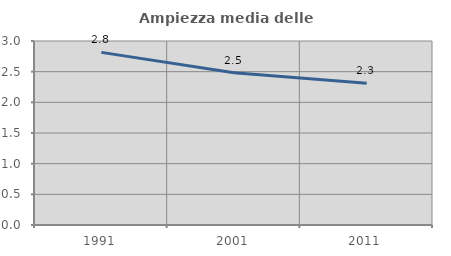
| Category | Ampiezza media delle famiglie |
|---|---|
| 1991.0 | 2.814 |
| 2001.0 | 2.483 |
| 2011.0 | 2.31 |